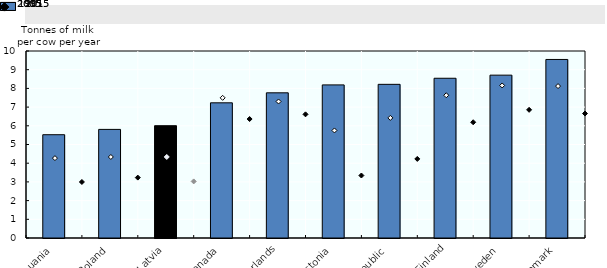
| Category | 2015 |
|---|---|
| Lithuania | 5.524 |
| Poland | 5.807 |
| Latvia | 6.006 |
| Canada | 7.229 |
| Netherlands | 7.764 |
| Estonia | 8.187 |
| Czech Republic | 8.217 |
| Finland | 8.542 |
| Sweden | 8.708 |
| Denmark | 9.548 |